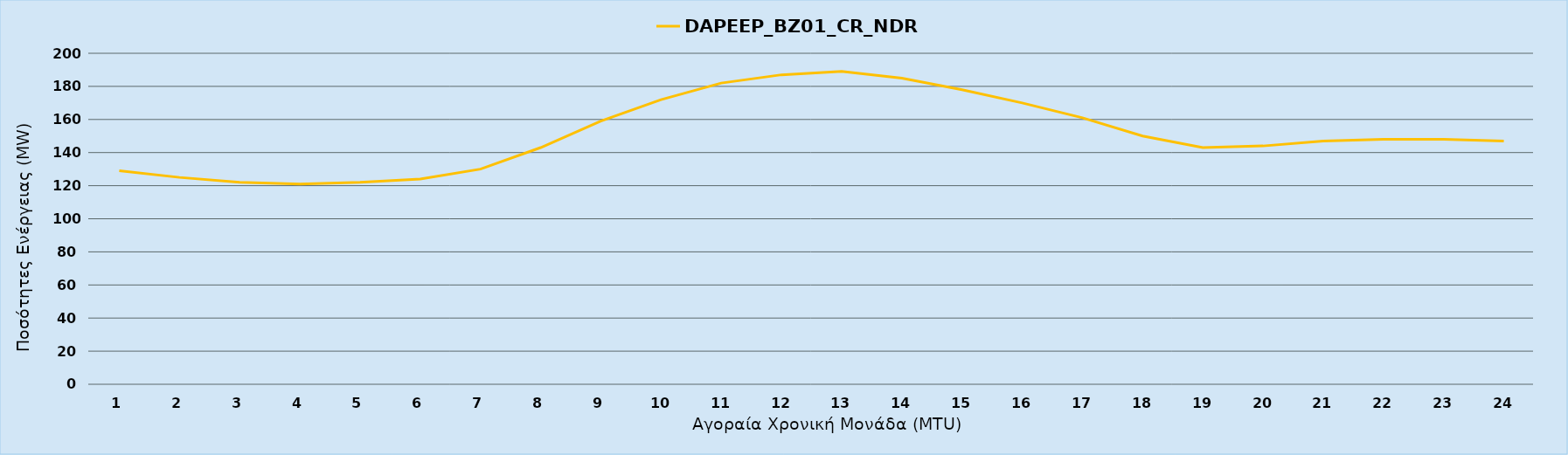
| Category | DAPEEP_BZ01_CR_NDR |
|---|---|
| 0 | 129 |
| 1 | 125 |
| 2 | 122 |
| 3 | 121 |
| 4 | 122 |
| 5 | 124 |
| 6 | 130 |
| 7 | 143 |
| 8 | 159 |
| 9 | 172 |
| 10 | 182 |
| 11 | 187 |
| 12 | 189 |
| 13 | 185 |
| 14 | 178 |
| 15 | 170 |
| 16 | 161 |
| 17 | 150 |
| 18 | 143 |
| 19 | 144 |
| 20 | 147 |
| 21 | 148 |
| 22 | 148 |
| 23 | 147 |